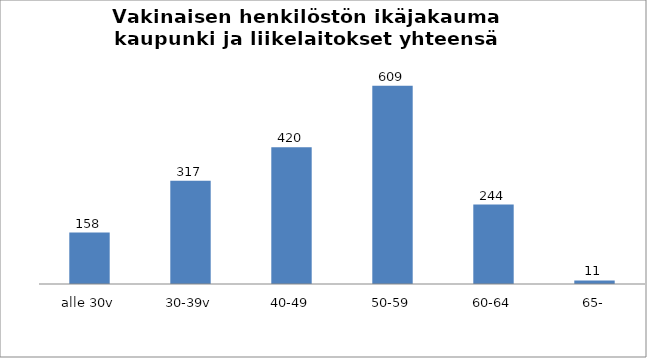
| Category | Series 0 |
|---|---|
| alle 30v | 158 |
| 30-39v | 317 |
| 40-49 | 420 |
| 50-59 | 609 |
| 60-64 | 244 |
| 65- | 11 |